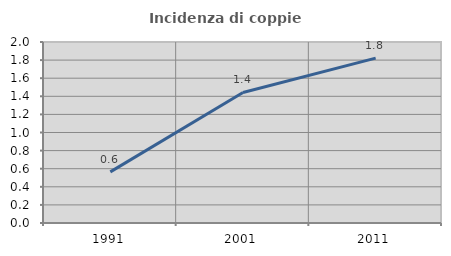
| Category | Incidenza di coppie miste |
|---|---|
| 1991.0 | 0.565 |
| 2001.0 | 1.442 |
| 2011.0 | 1.821 |